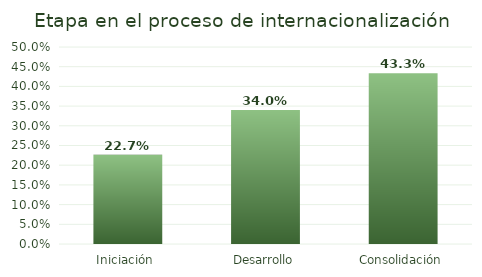
| Category | % empresas |
|---|---|
| Iniciación  | 0.227 |
| Desarrollo | 0.34 |
| Consolidación | 0.433 |